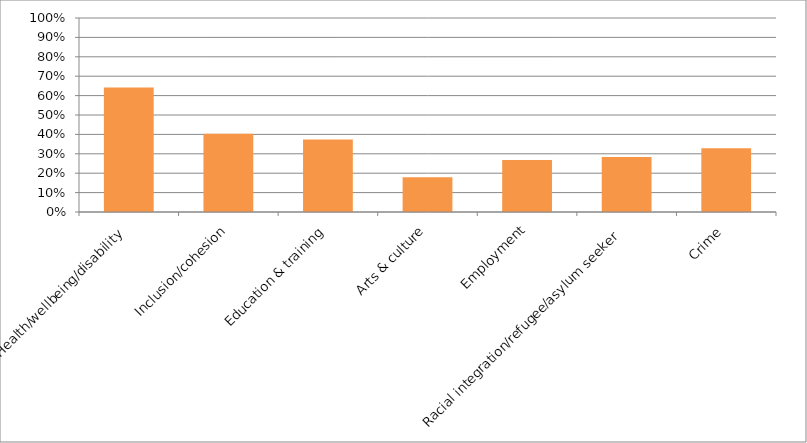
| Category | Series 0 |
|---|---|
| Health/wellbeing/disability | 0.642 |
| Inclusion/cohesion | 0.403 |
| Education & training | 0.373 |
| Arts & culture | 0.179 |
| Employment | 0.269 |
| Racial integration/refugee/asylum seeker | 0.284 |
| Crime | 0.328 |